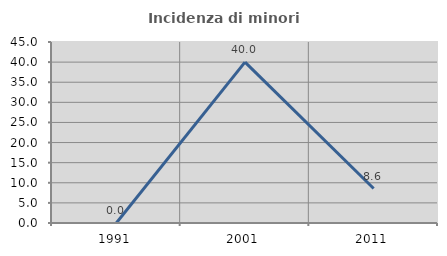
| Category | Incidenza di minori stranieri |
|---|---|
| 1991.0 | 0 |
| 2001.0 | 40 |
| 2011.0 | 8.571 |